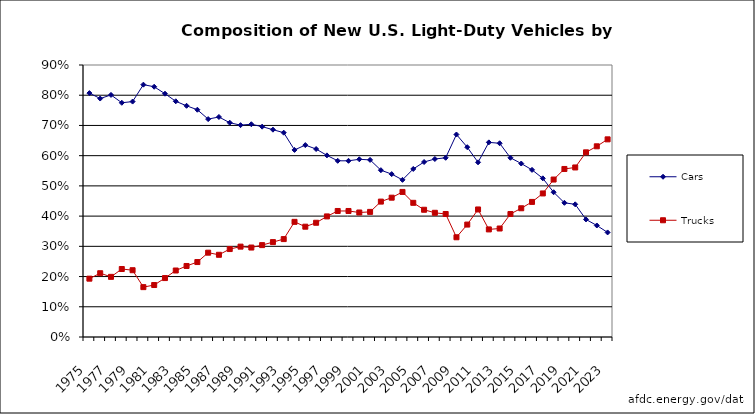
| Category | Cars | Trucks |
|---|---|---|
| 1975.0 | 0.807 | 0.193 |
| 1976.0 | 0.789 | 0.211 |
| 1977.0 | 0.801 | 0.199 |
| 1978.0 | 0.775 | 0.225 |
| 1979.0 | 0.779 | 0.221 |
| 1980.0 | 0.835 | 0.165 |
| 1981.0 | 0.828 | 0.172 |
| 1982.0 | 0.805 | 0.195 |
| 1983.0 | 0.78 | 0.22 |
| 1984.0 | 0.765 | 0.235 |
| 1985.0 | 0.752 | 0.248 |
| 1986.0 | 0.721 | 0.279 |
| 1987.0 | 0.728 | 0.272 |
| 1988.0 | 0.709 | 0.291 |
| 1989.0 | 0.701 | 0.299 |
| 1990.0 | 0.704 | 0.296 |
| 1991.0 | 0.696 | 0.304 |
| 1992.0 | 0.686 | 0.314 |
| 1993.0 | 0.676 | 0.324 |
| 1994.0 | 0.619 | 0.381 |
| 1995.0 | 0.635 | 0.365 |
| 1996.0 | 0.622 | 0.378 |
| 1997.0 | 0.601 | 0.399 |
| 1998.0 | 0.583 | 0.417 |
| 1999.0 | 0.583 | 0.417 |
| 2000.0 | 0.588 | 0.412 |
| 2001.0 | 0.586 | 0.414 |
| 2002.0 | 0.552 | 0.448 |
| 2003.0 | 0.539 | 0.461 |
| 2004.0 | 0.52 | 0.48 |
| 2005.0 | 0.556 | 0.444 |
| 2006.0 | 0.579 | 0.421 |
| 2007.0 | 0.589 | 0.411 |
| 2008.0 | 0.593 | 0.407 |
| 2009.0 | 0.67 | 0.33 |
| 2010.0 | 0.628 | 0.372 |
| 2011.0 | 0.578 | 0.422 |
| 2012.0 | 0.644 | 0.356 |
| 2013.0 | 0.641 | 0.359 |
| 2014.0 | 0.593 | 0.407 |
| 2015.0 | 0.574 | 0.426 |
| 2016.0 | 0.553 | 0.447 |
| 2017.0 | 0.525 | 0.475 |
| 2018.0 | 0.479 | 0.521 |
| 2019.0 | 0.444 | 0.556 |
| 2020.0 | 0.439 | 0.561 |
| 2021.0 | 0.389 | 0.611 |
| 2022.0 | 0.369 | 0.631 |
| 2023.0 | 0.346 | 0.654 |